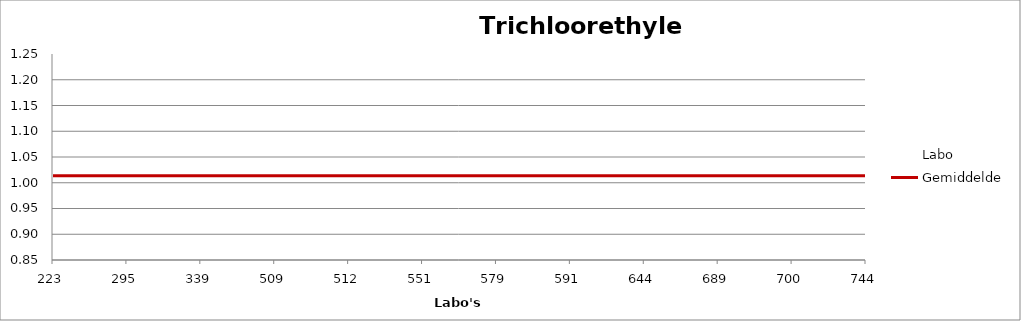
| Category | Labo | Gemiddelde |
|---|---|---|
| 223.0 | 1.114 | 1.014 |
| 295.0 | 1.007 | 1.014 |
| 339.0 | 1.029 | 1.014 |
| 509.0 | 0.941 | 1.014 |
| 512.0 | 0 | 1.014 |
| 551.0 | 1.143 | 1.014 |
| 579.0 | 0.959 | 1.014 |
| 591.0 | 1.044 | 1.014 |
| 644.0 | 0 | 1.014 |
| 689.0 | 0.974 | 1.014 |
| 700.0 | 1.043 | 1.014 |
| 744.0 | 0.883 | 1.014 |